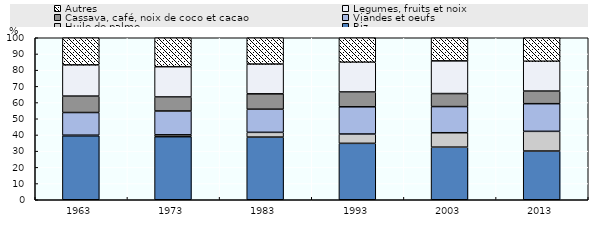
| Category | Riz | Huile de palme | Viandes et oeufs | Cassava, café, noix de coco et cacao | Legumes, fruits et noix | Autres |
|---|---|---|---|---|---|---|
| 1963.0 | 39.471 | 0.39 | 13.994 | 10.137 | 19.241 | 16.767 |
| 1973.0 | 38.923 | 1.157 | 14.705 | 8.679 | 18.666 | 17.87 |
| 1983.0 | 38.677 | 2.94 | 14.277 | 9.492 | 18.385 | 16.229 |
| 1993.0 | 34.821 | 5.775 | 16.784 | 9.168 | 18.356 | 15.096 |
| 2003.0 | 32.483 | 8.892 | 16.141 | 8.039 | 20.18 | 14.265 |
| 2013.0 | 30.077 | 12.158 | 17.066 | 7.796 | 18.41 | 14.492 |